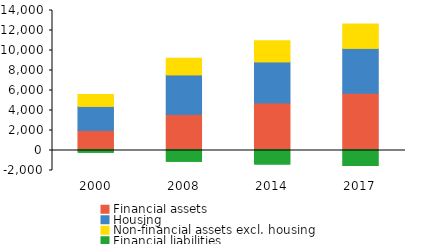
| Category | Financial assets | Housing | Non-financial assets excl. housing | Financial liabilities |
|---|---|---|---|---|
| 2000.0 | 1932.695 | 2385.693 | 1179.327 | -274.068 |
| 2008.0 | 3536.295 | 3931.946 | 1666.643 | -1174.134 |
| 2014.0 | 4684.402 | 4088.275 | 2091.701 | -1438.405 |
| 2017.0 | 5646.925 | 4478.417 | 2430.736 | -1604.79 |